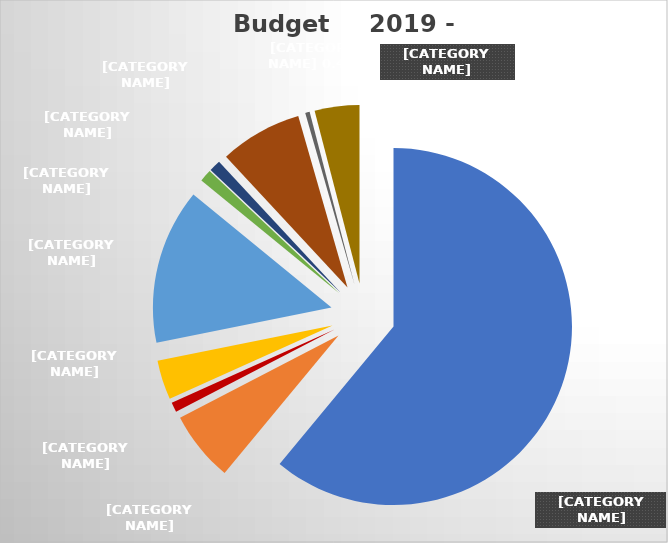
| Category |     Budget     2019 - 2020  | % of Budget |
|---|---|---|
| Salaries & Benefits * | 302265 | 0.61 |
| Other Lay Ministry | 31555 | 0.064 |
| Stewardship | 4350 | 0.009 |
| Growth & Communications | 17700 | 0.036 |
| Properties | 69750 | 0.141 |
| Youth | 5500 | 0.011 |
| Education | 5250 | 0.011 |
| BCA | 36956 | 0.075 |
| Fellowship | 2000 | 0.004 |
| Office | 20050 | 0.04 |